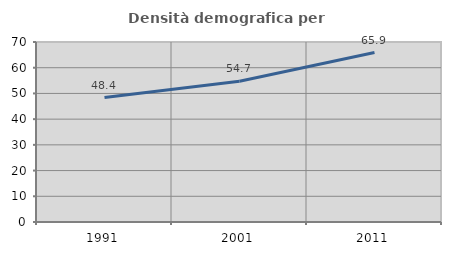
| Category | Densità demografica |
|---|---|
| 1991.0 | 48.383 |
| 2001.0 | 54.709 |
| 2011.0 | 65.888 |